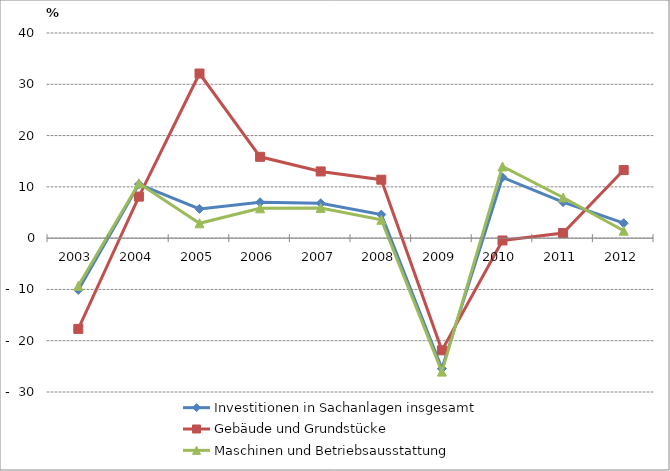
| Category | Investitionen in Sachanlagen insgesamt | Gebäude und Grundstücke | Maschinen und Betriebsausstattung |
|---|---|---|---|
| 2003.0 | -10.1 | -17.7 | -9.3 |
| 2004.0 | 10.5 | 8.1 | 10.7 |
| 2005.0 | 5.7 | 32.1 | 2.9 |
| 2006.0 | 6.991 | 15.857 | 5.812 |
| 2007.0 | 6.796 | 13.004 | 5.891 |
| 2008.0 | 4.6 | 11.4 | 3.579 |
| 2009.0 | -25.44 | -21.879 | -26.027 |
| 2010.0 | 11.843 | -0.455 | 13.982 |
| 2011.0 | 7.019 | 1.003 | 7.933 |
| 2012.0 | 2.918 | 13.273 | 1.446 |